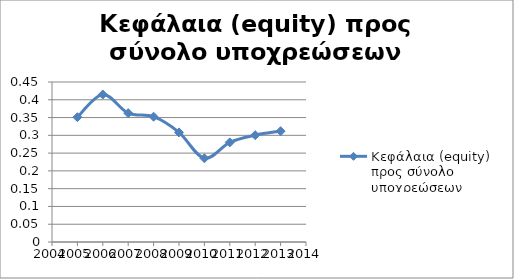
| Category | Κεφάλαια (equity) προς σύνολο υποχρεώσεων |
|---|---|
| 2005.0 | 0.351 |
| 2006.0 | 0.415 |
| 2007.0 | 0.362 |
| 2008.0 | 0.352 |
| 2009.0 | 0.308 |
| 2010.0 | 0.235 |
| 2011.0 | 0.28 |
| 2012.0 | 0.3 |
| 2013.0 | 0.312 |